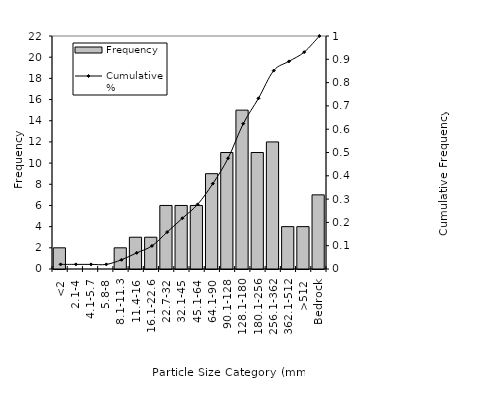
| Category | Frequency |
|---|---|
| <2 | 2 |
| 2.1-4 | 0 |
| 4.1-5.7 | 0 |
| 5.8-8 | 0 |
| 8.1-11.3 | 2 |
| 11.4-16 | 3 |
| 16.1-22.6 | 3 |
| 22.7-32 | 6 |
| 32.1-45 | 6 |
| 45.1-64 | 6 |
| 64.1-90 | 9 |
| 90.1-128 | 11 |
| 128.1-180 | 15 |
| 180.1-256 | 11 |
| 256.1-362 | 12 |
| 362.1-512 | 4 |
| >512 | 4 |
| Bedrock | 7 |